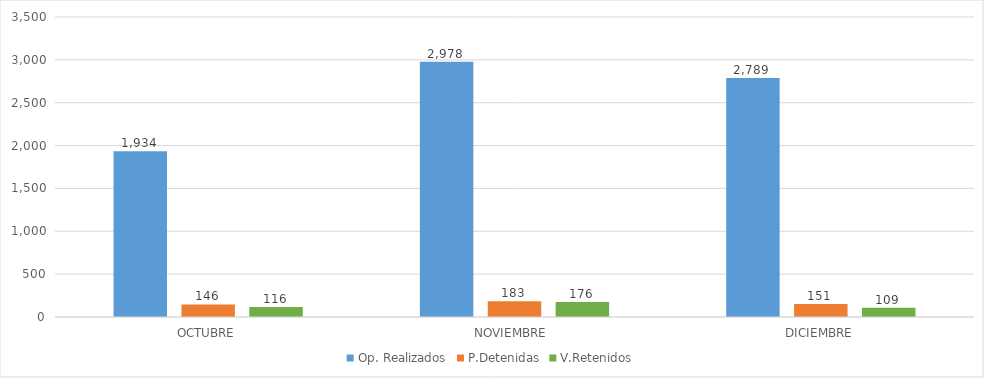
| Category | Op. Realizados | P.Detenidas | V.Retenidos |
|---|---|---|---|
| OCTUBRE | 1934 | 146 | 116 |
| NOVIEMBRE  | 2978 | 183 | 176 |
| DICIEMBRE | 2789 | 151 | 109 |